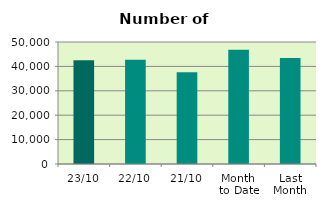
| Category | Series 0 |
|---|---|
| 23/10 | 42536 |
| 22/10 | 42690 |
| 21/10 | 37642 |
| Month 
to Date | 46848.235 |
| Last
Month | 43452.667 |